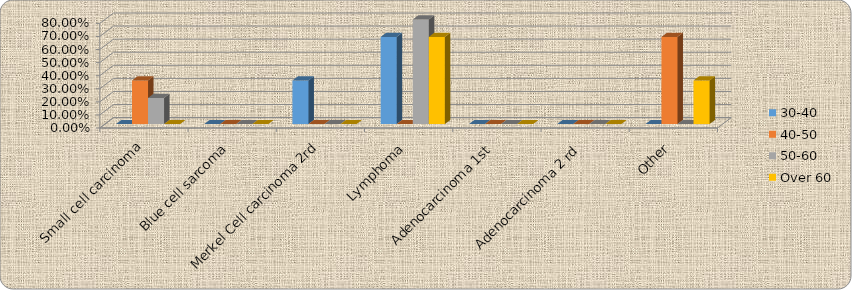
| Category | 30-40 | 40-50 | 50-60 | Over 60 |
|---|---|---|---|---|
| Small cell carcinoma | 0 | 0.333 | 0.2 | 0 |
| Blue cell sarcoma | 0 | 0 | 0 | 0 |
| Merkel Cell carcinoma 2rd | 0.333 | 0 | 0 | 0 |
| Lymphoma | 0.667 | 0 | 0.8 | 0.667 |
| Adenocarcinoma 1st | 0 | 0 | 0 | 0 |
| Adenocarcinoma 2 rd | 0 | 0 | 0 | 0 |
| Other | 0 | 0.667 | 0 | 0.333 |